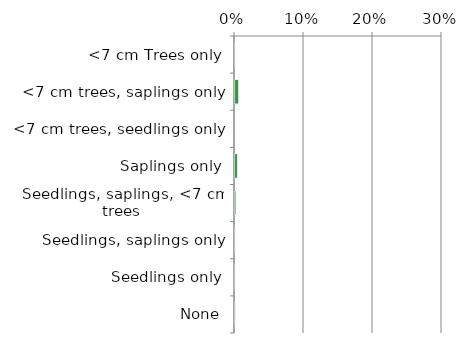
| Category | Near native & fragments |
|---|---|
| None | 0.002 |
| Seedlings only | 0 |
| Seedlings, saplings only | 0.002 |
| Seedlings, saplings, <7 cm trees | 0.003 |
| Saplings only | 0.005 |
| <7 cm trees, seedlings only | 0 |
| <7 cm trees, saplings only | 0.007 |
| <7 cm Trees only | 0.002 |